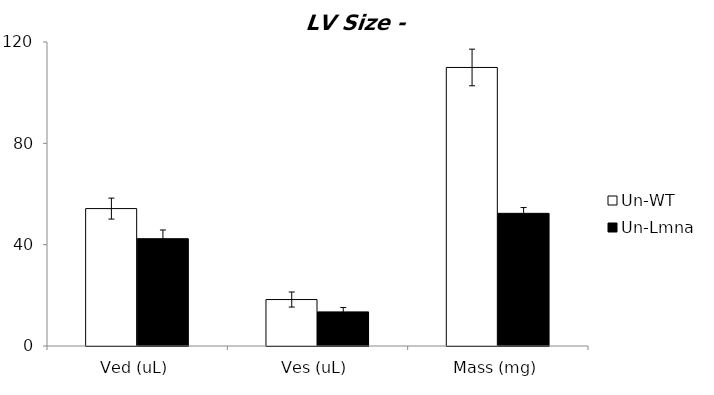
| Category | Un-WT | Un-Lmna |
|---|---|---|
| 0 | 54.243 | 42.351 |
| 1 | 18.342 | 13.47 |
| 2 | 109.948 | 52.365 |